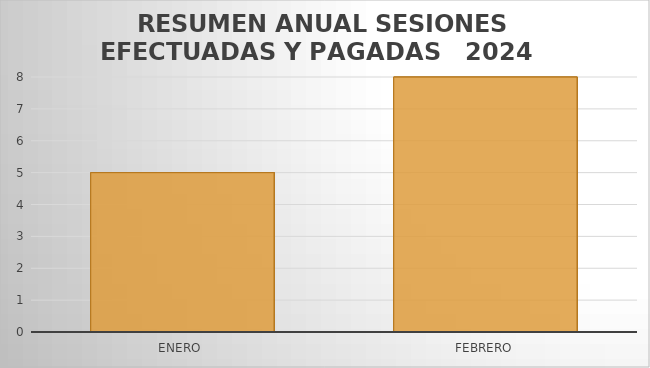
| Category | RESUMEN ANUAL SESIONES EFECTUADAS Y PAGADAS   2024 |
|---|---|
| Enero  | 5 |
| Febrero | 8 |